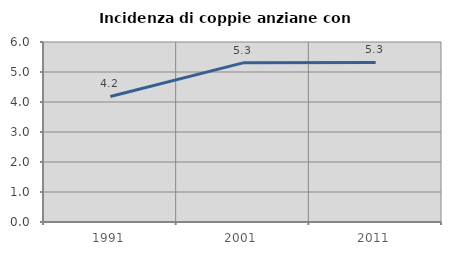
| Category | Incidenza di coppie anziane con figli |
|---|---|
| 1991.0 | 4.184 |
| 2001.0 | 5.305 |
| 2011.0 | 5.318 |